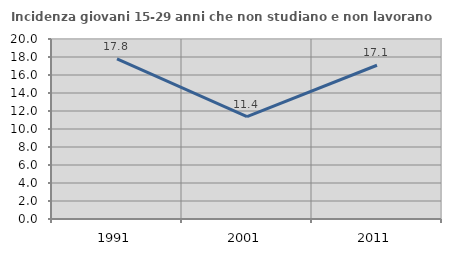
| Category | Incidenza giovani 15-29 anni che non studiano e non lavorano  |
|---|---|
| 1991.0 | 17.796 |
| 2001.0 | 11.378 |
| 2011.0 | 17.085 |